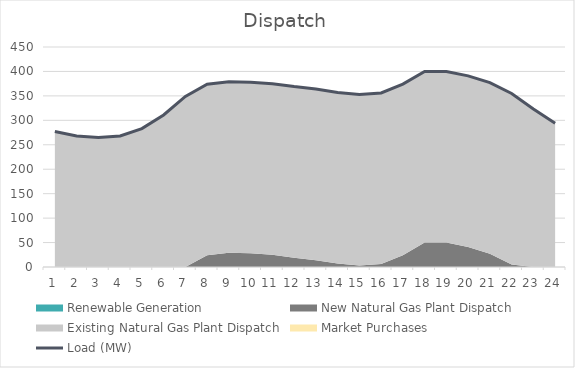
| Category | Load (MW) |
|---|---|
| 0 | 277 |
| 1 | 268 |
| 2 | 265 |
| 3 | 268 |
| 4 | 283 |
| 5 | 311 |
| 6 | 349 |
| 7 | 374 |
| 8 | 379 |
| 9 | 378 |
| 10 | 375 |
| 11 | 369 |
| 12 | 364 |
| 13 | 357 |
| 14 | 353 |
| 15 | 356 |
| 16 | 374 |
| 17 | 400 |
| 18 | 400 |
| 19 | 391 |
| 20 | 377 |
| 21 | 355 |
| 22 | 323 |
| 23 | 294 |